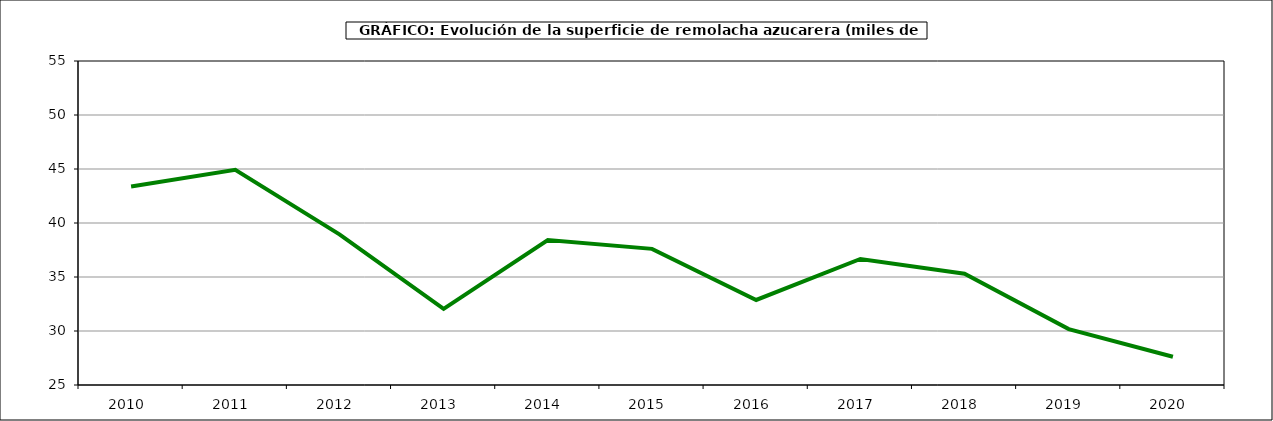
| Category | Superficie |
|---|---|
| 2010.0 | 43.382 |
| 2011.0 | 44.931 |
| 2012.0 | 38.952 |
| 2013.0 | 32.052 |
| 2014.0 | 38.414 |
| 2015.0 | 37.605 |
| 2016.0 | 32.874 |
| 2017.0 | 36.671 |
| 2018.0 | 35.297 |
| 2019.0 | 30.177 |
| 2020.0 | 27.621 |